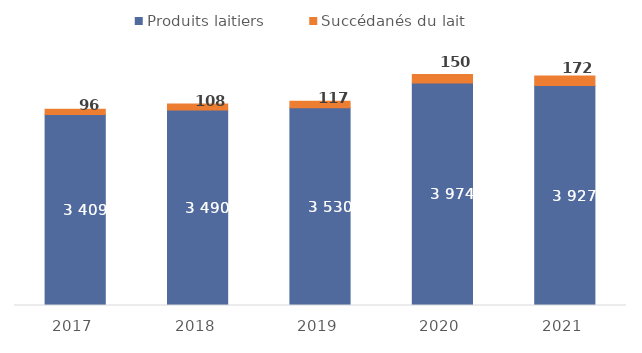
| Category | Produits laitiers  | Succédanés du lait |
|---|---|---|
| 2017 | 3408.524 | 95.908 |
| 2018 | 3490.403 | 108.106 |
| 2019 | 3530.149 | 116.953 |
| 2020 | 3973.887 | 150.225 |
| 2021 | 3927.355 | 171.922 |